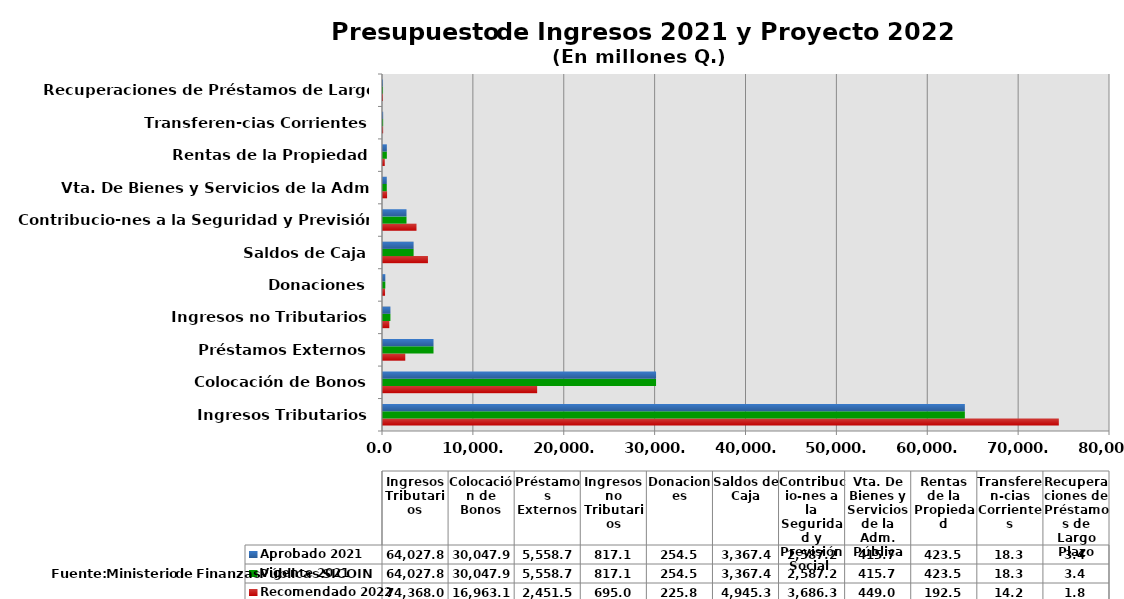
| Category | Recomendado 2022 | Vigente 2021 | Aprobado 2021 |
|---|---|---|---|
| Ingresos Tributarios | 74368 | 64027.8 | 64027.8 |
| Colocación de Bonos | 16963.1 | 30047.9 | 30047.9 |
| Préstamos Externos | 2451.5 | 5558.7 | 5558.7 |
| Ingresos no Tributarios | 695 | 817.1 | 817.1 |
| Donaciones | 225.8 | 254.5 | 254.5 |
| Saldos de Caja | 4945.3 | 3367.4 | 3367.4 |
| Contribucio-nes a la Seguridad y Previsión Social  | 3686.3 | 2587.2 | 2587.2 |
| Vta. De Bienes y Servicios de la Adm. Pública | 449 | 415.7 | 415.7 |
| Rentas de la Propiedad | 192.5 | 423.5 | 423.5 |
| Transferen-cias Corrientes | 14.2 | 18.3 | 18.3 |
| Recuperaciones de Préstamos de Largo Plazo | 1.8 | 3.4 | 3.4 |